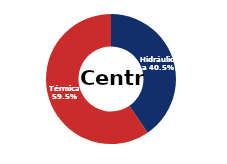
| Category | Centro |
|---|---|
| Eólica | 0 |
| Hidráulica | 1670.449 |
| Solar | 0.006 |
| Térmica | 2458.608 |